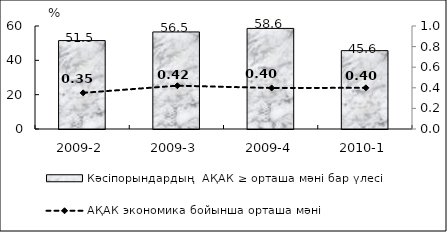
| Category | Кәсіпорындардың  АҚАК ≥ орташа мәні бар үлесі  |
|---|---|
| 2009-2 | 51.5 |
| 2009-3 | 56.54 |
| 2009-4 | 58.59 |
| 2010-1 | 45.64 |